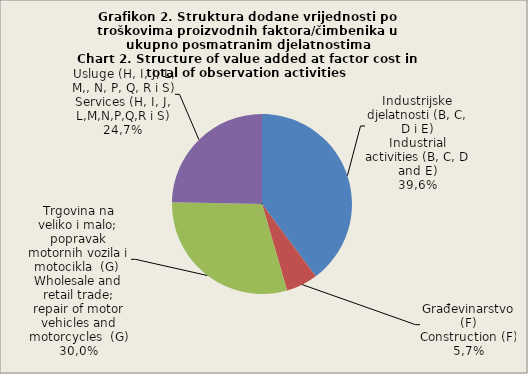
| Category | Dodana vrijednost po faktorskim troškovima
Value added at factor cost |
|---|---|
| Industrijske djelatnosti (B, C, D i E)
Industrial activities (B, C, D and E) | 39.8 |
| Građevinarstvo (F)
Construction (F) | 5.7 |
| Trgovina na veliko i malo; popravak motornih vozila i motocikla  (G) 
Wholesale and retail trade; repair of motor vehicles and motorcycles  (G)
 | 29.8 |
| Usluge (H, I i L)
Services (H, I and L) | 24.7 |